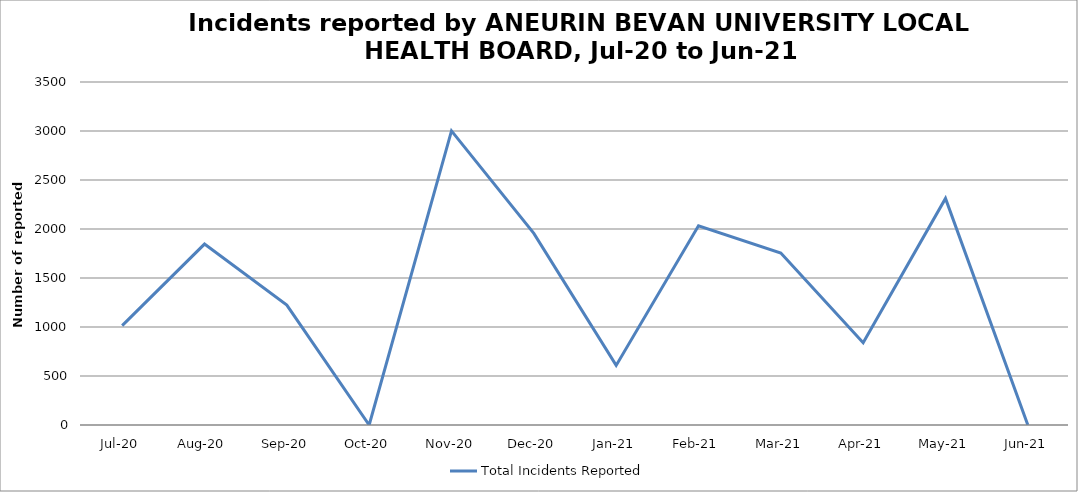
| Category | Total Incidents Reported |
|---|---|
| Jul-20 | 1014 |
| Aug-20 | 1846 |
| Sep-20 | 1224 |
| Oct-20 | 0 |
| Nov-20 | 3001 |
| Dec-20 | 1955 |
| Jan-21 | 608 |
| Feb-21 | 2033 |
| Mar-21 | 1755 |
| Apr-21 | 840 |
| May-21 | 2312 |
| Jun-21 | 0 |